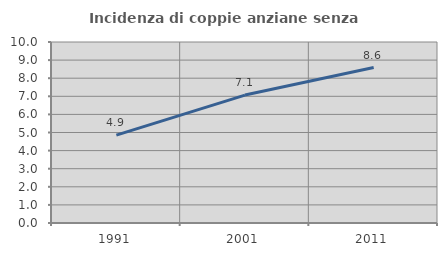
| Category | Incidenza di coppie anziane senza figli  |
|---|---|
| 1991.0 | 4.852 |
| 2001.0 | 7.067 |
| 2011.0 | 8.587 |